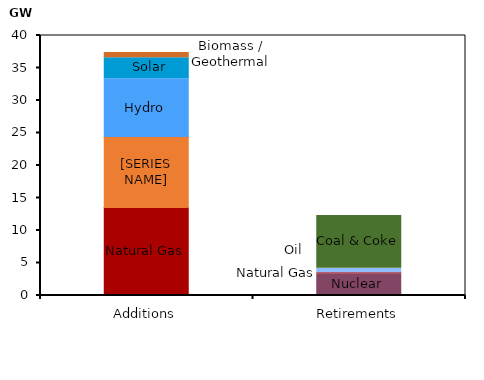
| Category | Nuclear | Natural Gas | Oil | Wind | Hydro | Solar | Biomass / Geothermal | Coal & Coke |
|---|---|---|---|---|---|---|---|---|
| Additions | 0 | 13.529 | 0 | 10.923 | 8.903 | 3.216 | 0.806 | 0 |
| Retirements | 3.36 | 0.15 | 0.667 | 0 | 0 | 0 | 0 | 8.126 |